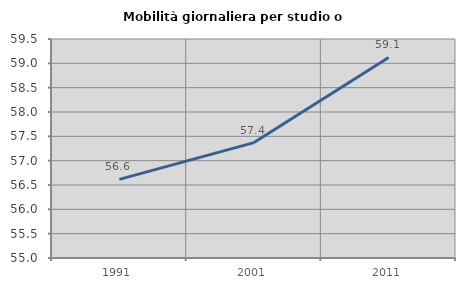
| Category | Mobilità giornaliera per studio o lavoro |
|---|---|
| 1991.0 | 56.615 |
| 2001.0 | 57.372 |
| 2011.0 | 59.122 |